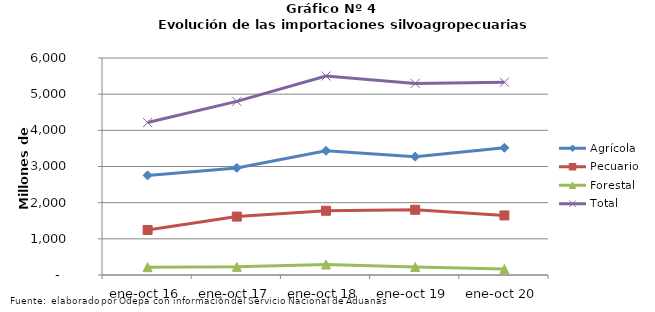
| Category | Agrícola | Pecuario | Forestal | Total |
|---|---|---|---|---|
| ene-oct 16 | 2753980 | 1245143 | 217006 | 4216129 |
| ene-oct 17 | 2961424 | 1615108 | 224714 | 4801246 |
| ene-oct 18 | 3434988 | 1776125 | 289524 | 5500637 |
| ene-oct 19 | 3272582 | 1802619 | 222098 | 5297299 |
| ene-oct 20 | 3517915 | 1646917 | 164357 | 5329189 |